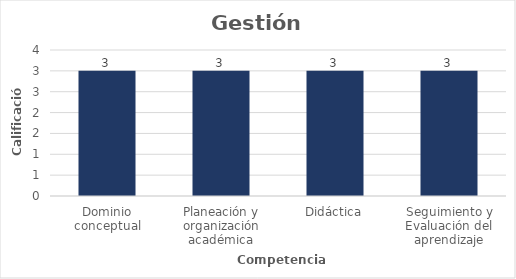
| Category | Series 0 |
|---|---|
| Dominio conceptual | 3 |
| Planeación y organización académica | 3 |
| Didáctica | 3 |
| Seguimiento y Evaluación del aprendizaje | 3 |